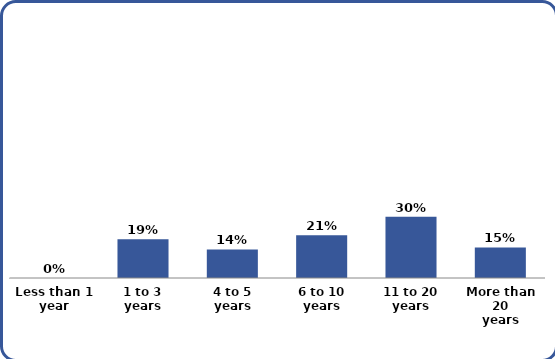
| Category | Series 0 |
|---|---|
| Less than 1
year | 0 |
| 1 to 3
years | 0.19 |
| 4 to 5
years | 0.14 |
| 6 to 10
years | 0.21 |
| 11 to 20
years | 0.3 |
| More than 20
years | 0.15 |